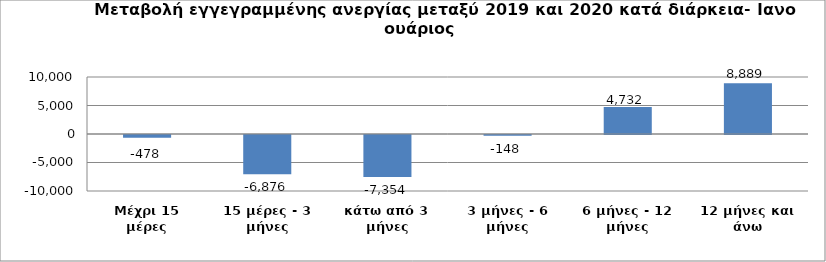
| Category | Series 0 |
|---|---|
| Μέχρι 15 μέρες | -478 |
| 15 μέρες - 3 μήνες | -6876 |
| κάτω από 3 μήνες | -7354 |
| 3 μήνες - 6 μήνες | -148 |
| 6 μήνες - 12 μήνες | 4732 |
| 12 μήνες και άνω | 8889 |